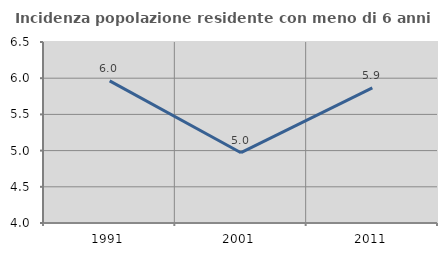
| Category | Incidenza popolazione residente con meno di 6 anni |
|---|---|
| 1991.0 | 5.963 |
| 2001.0 | 4.971 |
| 2011.0 | 5.866 |